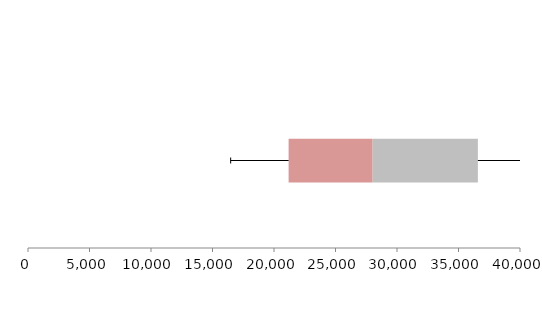
| Category | Series 1 | Series 2 | Series 3 |
|---|---|---|---|
| 0 | 21188.278 | 6830.92 | 8556.432 |